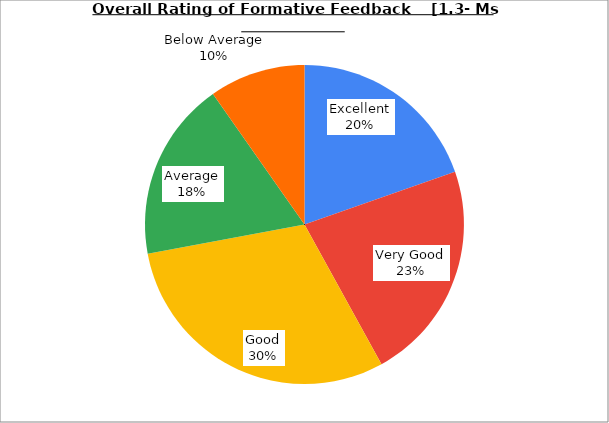
| Category | Series 0 |
|---|---|
| Excellent | 19.64 |
| Very Good | 22.342 |
| Good | 30.09 |
| Average | 18.198 |
| Below Average | 9.73 |